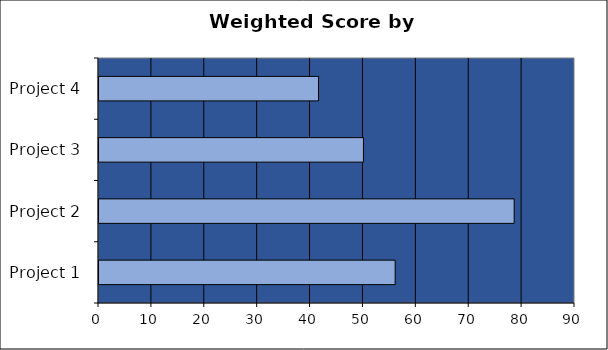
| Category | Series 0 |
|---|---|
| Project 1 | 56 |
| Project 2 | 78.5 |
| Project 3 | 50 |
| Project 4 | 41.5 |